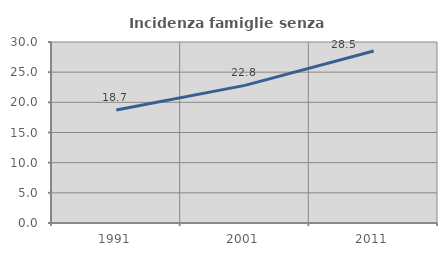
| Category | Incidenza famiglie senza nuclei |
|---|---|
| 1991.0 | 18.731 |
| 2001.0 | 22.81 |
| 2011.0 | 28.5 |